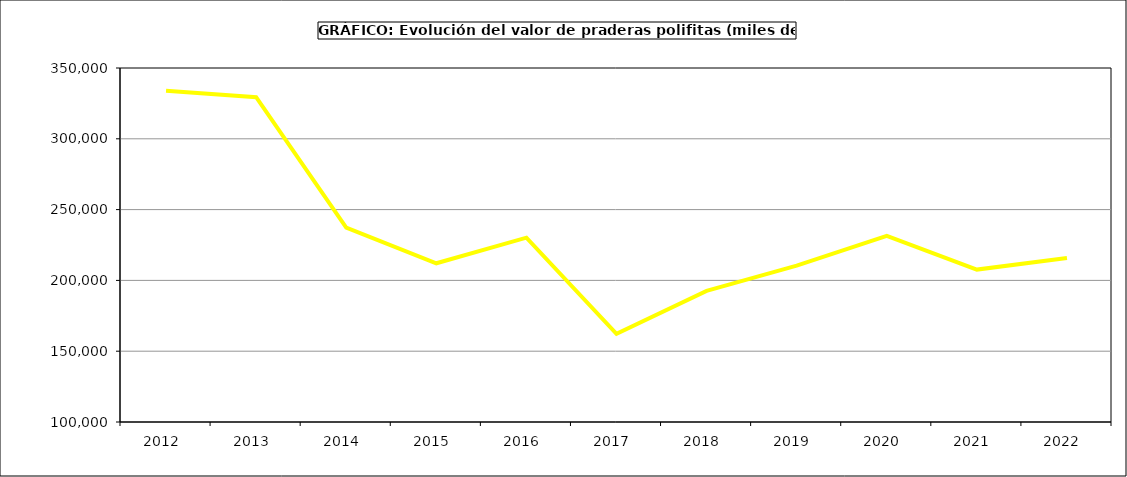
| Category | Valor |
|---|---|
| 2012.0 | 333939.944 |
| 2013.0 | 329402.741 |
| 2014.0 | 237285.995 |
| 2015.0 | 212093 |
| 2016.0 | 230171 |
| 2017.0 | 162246.482 |
| 2018.0 | 192621.026 |
| 2019.0 | 210388.231 |
| 2020.0 | 231497.752 |
| 2021.0 | 207642.098 |
| 2022.0 | 215826.552 |